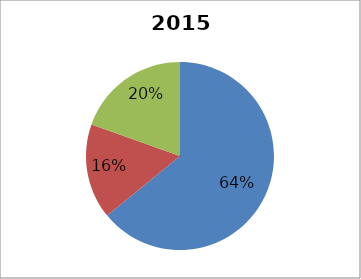
| Category | 2013 Breakdown |
|---|---|
| Technical Analysis | 0.641 |
| Tool Development, Research, Regional Coordination  | 0.164 |
| Administration | 0.195 |